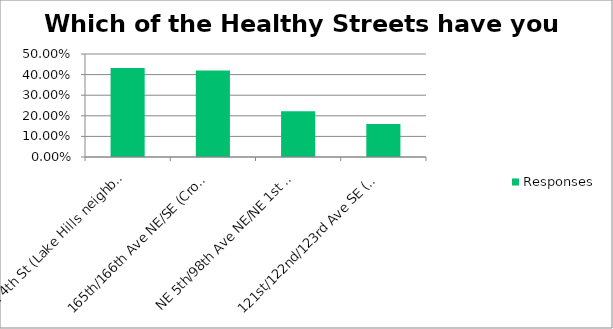
| Category | Responses |
|---|---|
| SE 4th St (Lake Hills neighborhood) | 0.432 |
| 165th/166th Ave NE/SE (Crossroads/Lake Hills/West Lake Sammamish neighborhoods) | 0.42 |
| NE 5th/98th Ave NE/NE 1st Street (Northwest Bellevue neighborhood) | 0.222 |
| 121st/122nd/123rd Ave SE (Newport Hills neighborhood) | 0.16 |